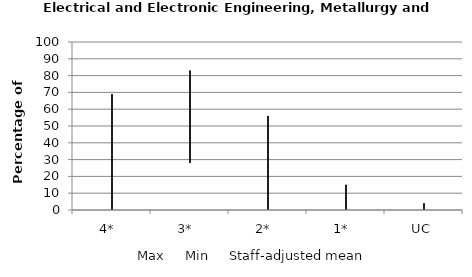
| Category | Max | Min | Staff-adjusted mean |
|---|---|---|---|
| 4*  | 69 | 0 | 25 |
| 3*  | 83 | 28 | 62 |
| 2*  | 56 | 0 | 11 |
| 1*  | 15 | 0 | 2 |
| UC | 4 | 0 | 0 |